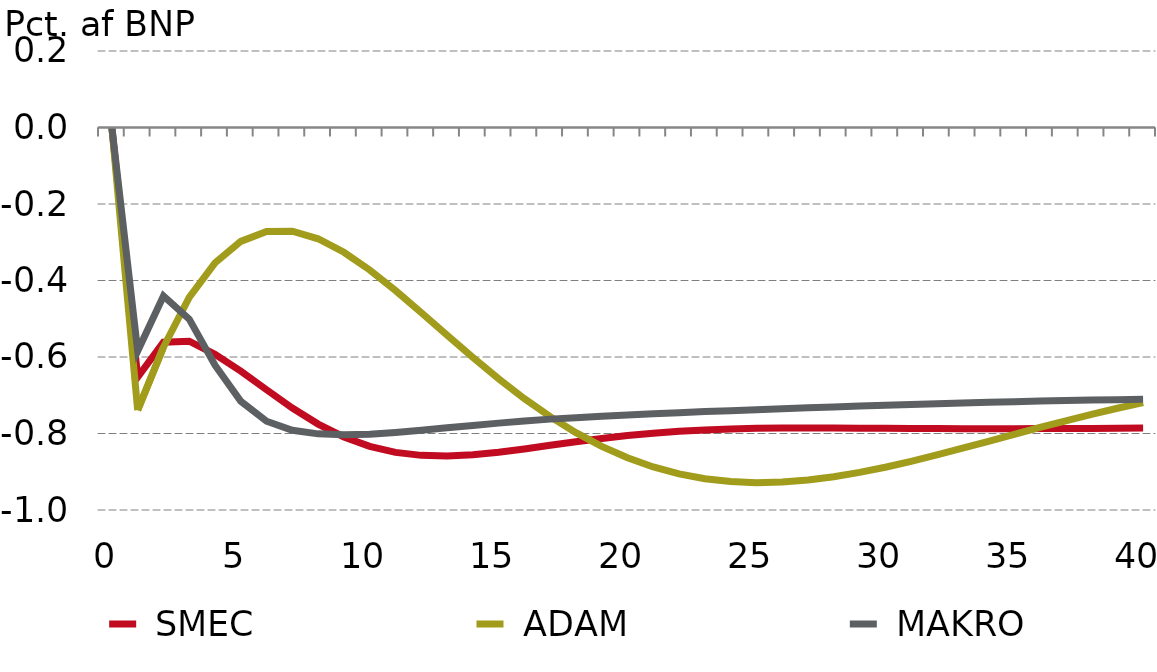
| Category |  SMEC |  ADAM |  MAKRO |
|---|---|---|---|
| 0.0 | 0 | 0 | 0 |
| nan | -0.652 | -0.739 | -0.584 |
| nan | -0.561 | -0.574 | -0.44 |
| nan | -0.559 | -0.444 | -0.501 |
| nan | -0.593 | -0.354 | -0.622 |
| 5.0 | -0.637 | -0.298 | -0.716 |
| nan | -0.686 | -0.272 | -0.768 |
| nan | -0.733 | -0.271 | -0.792 |
| nan | -0.775 | -0.291 | -0.801 |
| nan | -0.809 | -0.326 | -0.803 |
| 10.0 | -0.834 | -0.372 | -0.802 |
| nan | -0.849 | -0.426 | -0.798 |
| nan | -0.857 | -0.484 | -0.792 |
| nan | -0.859 | -0.543 | -0.785 |
| nan | -0.855 | -0.601 | -0.779 |
| 15.0 | -0.849 | -0.657 | -0.773 |
| nan | -0.84 | -0.709 | -0.767 |
| nan | -0.831 | -0.756 | -0.762 |
| nan | -0.822 | -0.798 | -0.759 |
| nan | -0.813 | -0.834 | -0.755 |
| 20.0 | -0.805 | -0.864 | -0.752 |
| nan | -0.799 | -0.887 | -0.748 |
| nan | -0.794 | -0.906 | -0.745 |
| nan | -0.791 | -0.918 | -0.743 |
| nan | -0.788 | -0.926 | -0.74 |
| 25.0 | -0.787 | -0.928 | -0.738 |
| nan | -0.786 | -0.927 | -0.735 |
| nan | -0.786 | -0.922 | -0.733 |
| nan | -0.786 | -0.913 | -0.731 |
| nan | -0.786 | -0.902 | -0.728 |
| 30.0 | -0.786 | -0.888 | -0.726 |
| nan | -0.787 | -0.873 | -0.724 |
| nan | -0.787 | -0.856 | -0.722 |
| nan | -0.787 | -0.838 | -0.72 |
| nan | -0.787 | -0.82 | -0.718 |
| 35.0 | -0.787 | -0.802 | -0.717 |
| nan | -0.787 | -0.784 | -0.715 |
| nan | -0.787 | -0.767 | -0.714 |
| nan | -0.787 | -0.75 | -0.713 |
| nan | -0.786 | -0.734 | -0.711 |
| 40.0 | -0.786 | -0.719 | -0.711 |